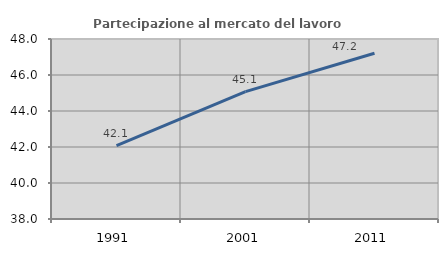
| Category | Partecipazione al mercato del lavoro  femminile |
|---|---|
| 1991.0 | 42.074 |
| 2001.0 | 45.073 |
| 2011.0 | 47.208 |